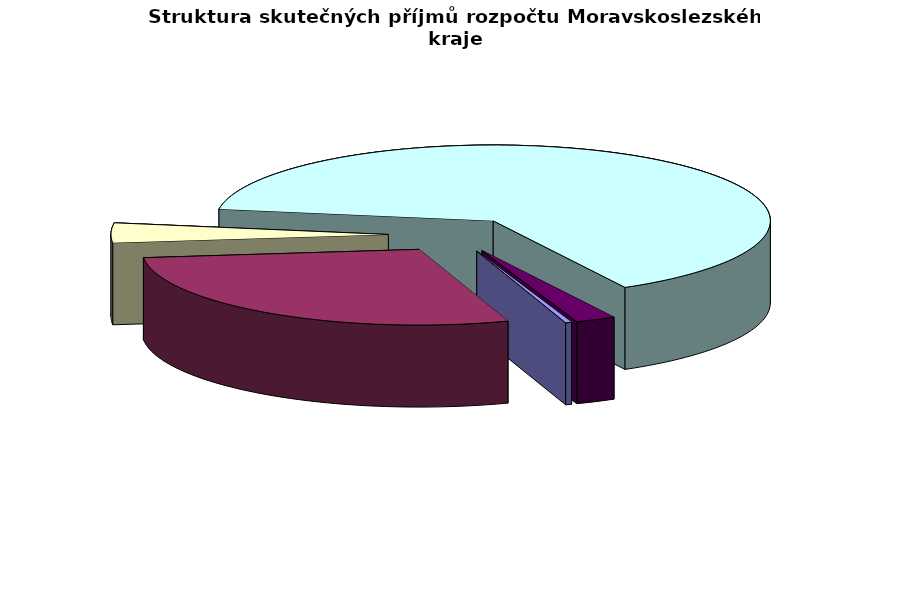
| Category | Čerpání v tis. Kč |
|---|---|
| Kapitálové příjmy | 86808.154 |
| Daňové příjmy | 6849224.412 |
| Investiční dotace | 1015098.897 |
| Neinvestiční dotace | 15569867.779 |
| Nedaňové příjmy | 563850.137 |